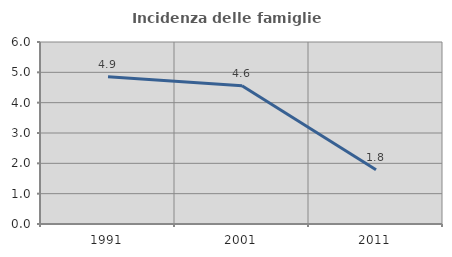
| Category | Incidenza delle famiglie numerose |
|---|---|
| 1991.0 | 4.856 |
| 2001.0 | 4.558 |
| 2011.0 | 1.792 |